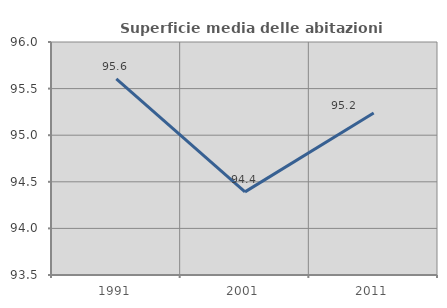
| Category | Superficie media delle abitazioni occupate |
|---|---|
| 1991.0 | 95.604 |
| 2001.0 | 94.392 |
| 2011.0 | 95.238 |